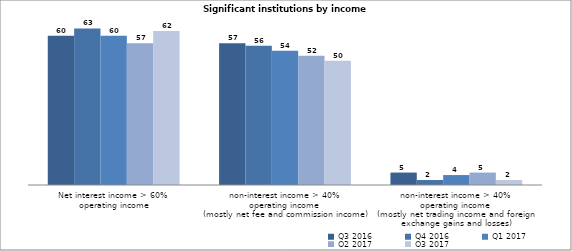
| Category | Q3 2016 | Q4 2016 | Q1 2017 | Q2 2017 | Q3 2017 |
|---|---|---|---|---|---|
| Net interest income > 60% 
operating income | 60 | 63 | 60 | 57 | 62 |
| non-interest income > 40% 
operating income 
(mostly net fee and commission income) | 57 | 56 | 54 | 52 | 50 |
| non-interest income > 40% 
operating income 
(mostly net trading income and foreign exchange gains and losses) | 5 | 2 | 4 | 5 | 2 |